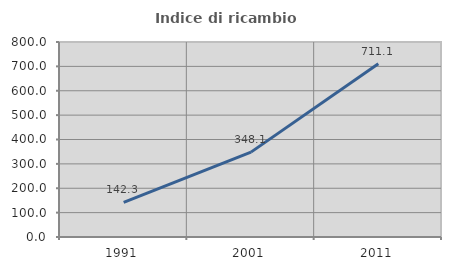
| Category | Indice di ricambio occupazionale  |
|---|---|
| 1991.0 | 142.308 |
| 2001.0 | 348.148 |
| 2011.0 | 711.111 |